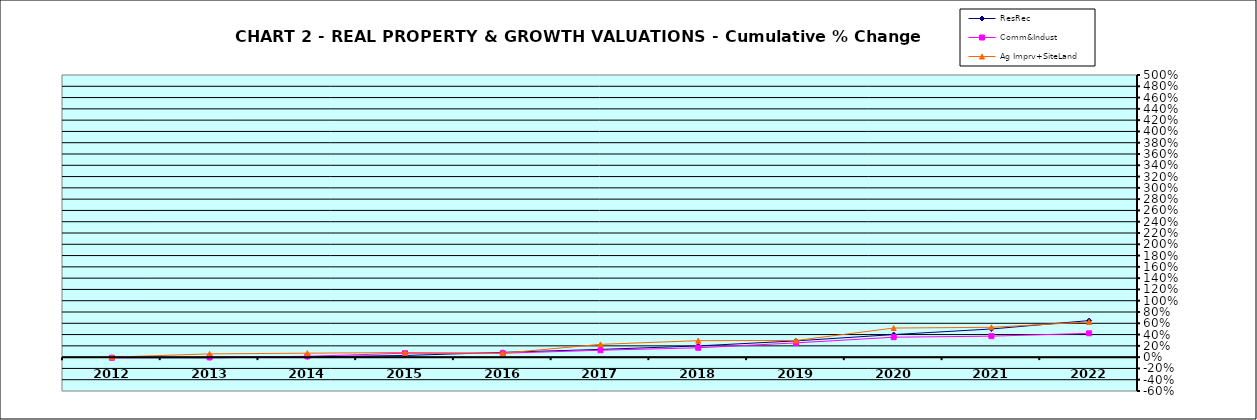
| Category | ResRec | Comm&Indust | Ag Imprv+SiteLand |
|---|---|---|---|
| 2012.0 | -0.009 | -0.012 | 0 |
| 2013.0 | -0.012 | -0.003 | 0.058 |
| 2014.0 | 0.005 | 0.015 | 0.07 |
| 2015.0 | 0.029 | 0.07 | 0.082 |
| 2016.0 | 0.085 | 0.069 | 0.069 |
| 2017.0 | 0.137 | 0.122 | 0.227 |
| 2018.0 | 0.199 | 0.166 | 0.292 |
| 2019.0 | 0.288 | 0.252 | 0.295 |
| 2020.0 | 0.4 | 0.353 | 0.516 |
| 2021.0 | 0.499 | 0.372 | 0.529 |
| 2022.0 | 0.648 | 0.422 | 0.624 |